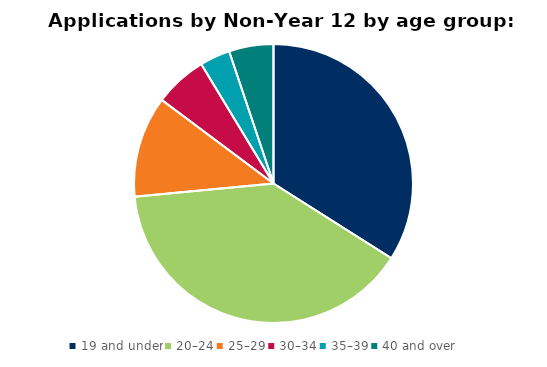
| Category | Series 0 |
|---|---|
| 19 and under | 8516 |
| 20–24 | 9893 |
| 25–29 | 2939 |
| 30–34 | 1532 |
| 35–39 | 879 |
| 40 and over | 1291 |